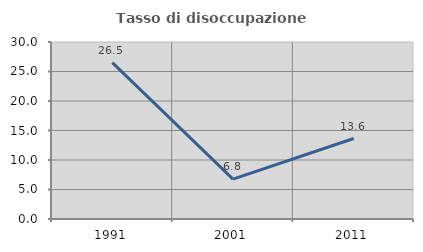
| Category | Tasso di disoccupazione giovanile  |
|---|---|
| 1991.0 | 26.515 |
| 2001.0 | 6.757 |
| 2011.0 | 13.636 |